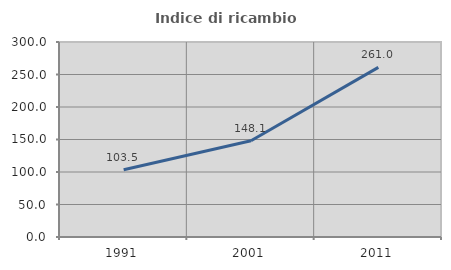
| Category | Indice di ricambio occupazionale  |
|---|---|
| 1991.0 | 103.534 |
| 2001.0 | 148.14 |
| 2011.0 | 260.985 |